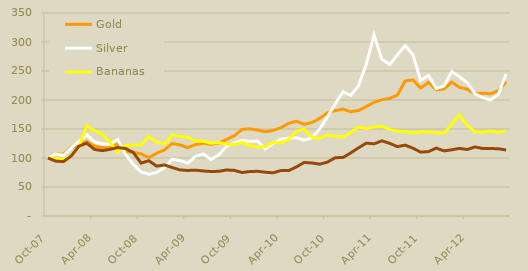
| Category | Gold | Silver | Bananas | Coffee, Robusta |
|---|---|---|---|---|
| 2007-10-01 | 100 | 100 | 100 | 100 |
| 2007-11-01 | 106.845 | 106.926 | 99.029 | 94.613 |
| 2007-12-01 | 106.44 | 104.305 | 98.262 | 93.761 |
| 2008-01-01 | 117.89 | 117.034 | 103.003 | 103.376 |
| 2008-02-01 | 122.224 | 128.747 | 119.788 | 120.298 |
| 2008-03-01 | 128.337 | 140.041 | 155.665 | 125.644 |
| 2008-04-01 | 120.555 | 127.613 | 146.973 | 114.787 |
| 2008-05-01 | 117.766 | 124.249 | 140.6 | 112.663 |
| 2008-06-01 | 117.876 | 124.179 | 127.243 | 114.972 |
| 2008-07-01 | 124.539 | 131.646 | 109.873 | 118.04 |
| 2008-08-01 | 111.189 | 106.241 | 121.382 | 116.398 |
| 2008-09-01 | 109.983 | 88.861 | 122.22 | 109.461 |
| 2008-10-01 | 106.894 | 75.991 | 122.429 | 91.237 |
| 2008-11-01 | 100.83 | 71.914 | 137.08 | 95.351 |
| 2008-12-01 | 108.149 | 75.185 | 127.661 | 86.013 |
| 2009-01-01 | 113.794 | 83.073 | 123.476 | 88.014 |
| 2009-02-01 | 124.967 | 97.924 | 139.695 | 83.602 |
| 2009-03-01 | 122.485 | 95.579 | 137.289 | 79.507 |
| 2009-04-01 | 117.97 | 91.244 | 136.033 | 78.502 |
| 2009-05-01 | 123.065 | 102.847 | 129.231 | 79.066 |
| 2009-06-01 | 125.321 | 106.833 | 128.918 | 77.63 |
| 2009-07-01 | 123.805 | 97.556 | 125.569 | 76.778 |
| 2009-08-01 | 125.812 | 105.166 | 126.616 | 77.004 |
| 2009-09-01 | 132.069 | 120.137 | 123.999 | 79.333 |
| 2009-10-01 | 138.24 | 125.815 | 122.952 | 78.687 |
| 2009-11-01 | 149.356 | 130.281 | 126.616 | 74.992 |
| 2009-12-01 | 150.374 | 128.589 | 121.382 | 76.634 |
| 2010-01-01 | 148.153 | 129.361 | 118.593 | 77.075 |
| 2010-02-01 | 145.164 | 115.672 | 119.814 | 75.444 |
| 2010-03-01 | 147.54 | 125.018 | 127.661 | 74.448 |
| 2010-04-01 | 152.225 | 132.406 | 125.522 | 78.368 |
| 2010-05-01 | 159.744 | 134.257 | 132.196 | 78.235 |
| 2010-06-01 | 163.387 | 135.073 | 146.192 | 84.669 |
| 2010-07-01 | 158.093 | 130.74 | 149.561 | 92.304 |
| 2010-08-01 | 161.12 | 134.768 | 135.842 | 91.39 |
| 2010-09-01 | 168.431 | 150.209 | 133.94 | 89.389 |
| 2010-10-01 | 177.845 | 171.033 | 139.671 | 92.94 |
| 2010-11-01 | 181.539 | 193.649 | 137.603 | 100.503 |
| 2010-12-01 | 184.276 | 214.066 | 136.033 | 100.893 |
| 2011-01-01 | 179.751 | 208.076 | 143.856 | 108.805 |
| 2011-02-01 | 181.915 | 224.888 | 153.508 | 117.619 |
| 2011-03-01 | 188.709 | 261.965 | 150.636 | 125.664 |
| 2011-04-01 | 196.099 | 311.899 | 153.561 | 124.464 |
| 2011-05-01 | 200.451 | 270.235 | 154.868 | 129.605 |
| 2011-06-01 | 202.579 | 261.199 | 149.445 | 125.346 |
| 2011-07-01 | 208.35 | 277.803 | 146.098 | 119.631 |
| 2011-08-01 | 232.866 | 293.71 | 145.497 | 122.114 |
| 2011-09-01 | 234.687 | 277.885 | 143.262 | 116.921 |
| 2011-10-01 | 220.675 | 233.669 | 144.903 | 110.149 |
| 2011-11-01 | 230.335 | 242.428 | 145.356 | 111.011 |
| 2011-12-01 | 217.578 | 219.597 | 143.453 | 117.055 |
| 2012-01-01 | 218.952 | 224.233 | 142.882 | 112.263 |
| 2012-02-01 | 230.869 | 248.995 | 158.356 | 114.161 |
| 2012-03-01 | 221.809 | 239.981 | 174.464 | 116.573 |
| 2012-04-01 | 218.618 | 229.924 | 155.964 | 114.633 |
| 2012-05-01 | 210.865 | 210.515 | 144.768 | 119.046 |
| 2012-06-01 | 211.869 | 203.937 | 144.903 | 116.306 |
| 2012-07-01 | 210.694 | 199.975 | 146.497 | 116.337 |
| 2012-08-01 | 216.05 | 209.665 | 144.677 | 115.967 |
| 2012-09-01 | 231.223 | 244.93 | 146.497 | 113.771 |